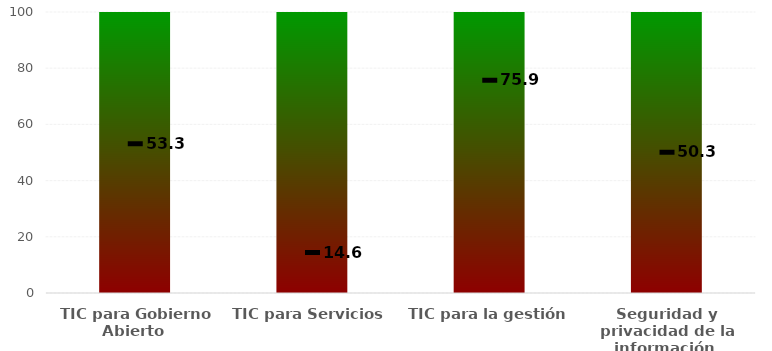
| Category | Series 0 |
|---|---|
| TIC para Gobierno Abierto  | 100 |
| TIC para Servicios  | 100 |
| TIC para la gestión | 100 |
| Seguridad y privacidad de la información  | 100 |